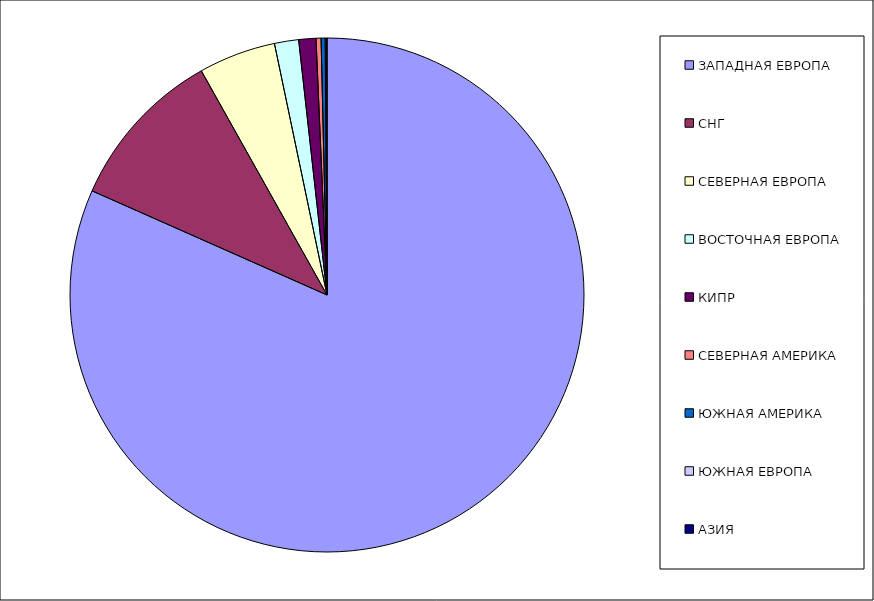
| Category | Оборот |
|---|---|
| ЗАПАДНАЯ ЕВРОПА | 0.816 |
| СНГ | 0.102 |
| СЕВЕРНАЯ ЕВРОПА | 0.049 |
| ВОСТОЧНАЯ ЕВРОПА | 0.015 |
| КИПР | 0.011 |
| СЕВЕРНАЯ АМЕРИКА | 0.003 |
| ЮЖНАЯ АМЕРИКА | 0.003 |
| ЮЖНАЯ ЕВРОПА | 0.001 |
| АЗИЯ | 0 |